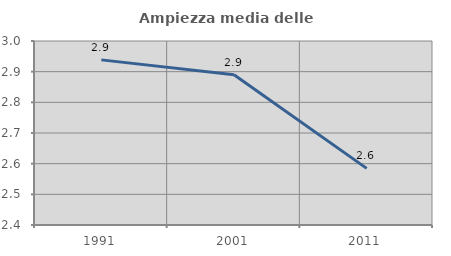
| Category | Ampiezza media delle famiglie |
|---|---|
| 1991.0 | 2.938 |
| 2001.0 | 2.89 |
| 2011.0 | 2.585 |